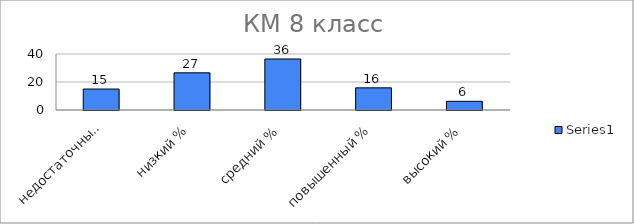
| Category | Series 0 |
|---|---|
| недостаточный % | 14.972 |
| низкий % | 26.554 |
| средний % | 36.441 |
| повышенный % | 15.819 |
| высокий % | 6.215 |